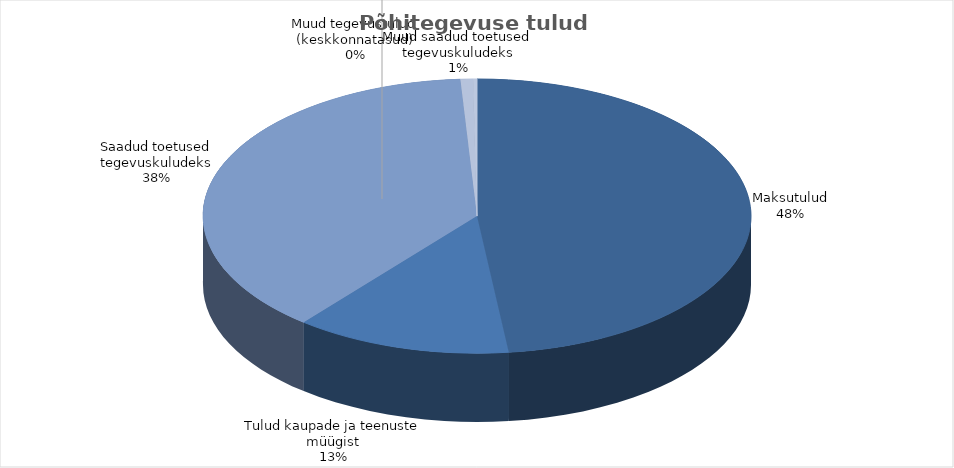
| Category | Series 0 |
|---|---|
| 0 | 5602084 |
| 1 | 1482761 |
| 2 | 4436994 |
| 3 | 85810 |
| 4 | 26900 |